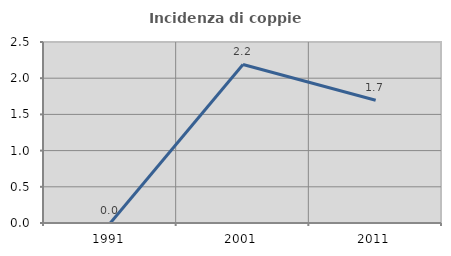
| Category | Incidenza di coppie miste |
|---|---|
| 1991.0 | 0 |
| 2001.0 | 2.19 |
| 2011.0 | 1.695 |